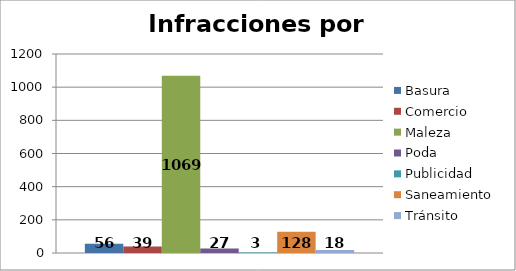
| Category | Basura  | Comercio  | Maleza  | Poda  | Publicidad  | Saneamiento  | Tránsito  |
|---|---|---|---|---|---|---|---|
| 0 | 56 | 39 | 1069 | 27 | 3 | 128 | 18 |